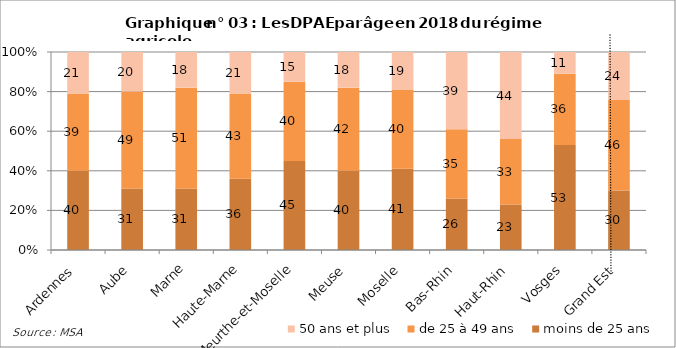
| Category | moins de 25 ans | de 25 à 49 ans | 50 ans et plus |
|---|---|---|---|
| Ardennes | 40 | 39 | 21 |
| Aube | 31 | 49 | 20 |
| Marne | 31 | 51 | 18 |
| Haute-Marne | 36 | 43 | 21 |
| Meurthe-et-Moselle | 45 | 40 | 15 |
| Meuse | 40 | 42 | 18 |
| Moselle | 41 | 40 | 19 |
| Bas-Rhin | 26 | 35 | 39 |
| Haut-Rhin | 23 | 33 | 44 |
| Vosges | 53 | 36 | 11 |
| Grand Est | 30 | 46 | 24 |